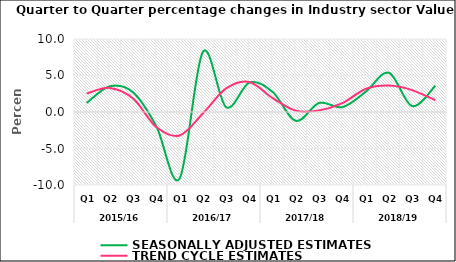
| Category | SEASONALLY ADJUSTED ESTIMATES | TREND CYCLE ESTIMATES |
|---|---|---|
| 0 | 1.242 | 2.53 |
| 1 | 3.522 | 3.301 |
| 2 | 2.68 | 1.85 |
| 3 | -1.976 | -2.061 |
| 4 | -9.107 | -3.212 |
| 5 | 8.238 | -0.202 |
| 6 | 0.662 | 3.228 |
| 7 | 4.023 | 4.119 |
| 8 | 2.746 | 1.909 |
| 9 | -1.213 | 0.19 |
| 10 | 1.238 | 0.223 |
| 11 | 0.665 | 1.211 |
| 12 | 2.757 | 3.156 |
| 13 | 5.365 | 3.619 |
| 14 | 0.813 | 2.998 |
| 15 | 3.601 | 1.61 |